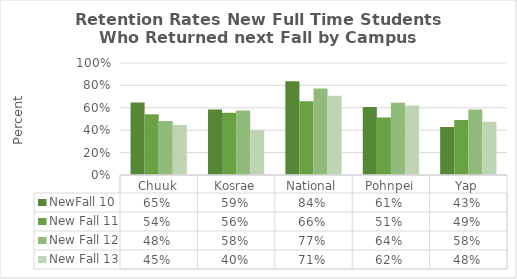
| Category | NewFall 10 | New Fall 11 | New Fall 12 | New Fall 13 |
|---|---|---|---|---|
| Chuuk | 0.647 | 0.542 | 0.482 | 0.447 |
| Kosrae | 0.585 | 0.556 | 0.576 | 0.4 |
| National | 0.836 | 0.658 | 0.772 | 0.708 |
| Pohnpei | 0.606 | 0.514 | 0.644 | 0.621 |
| Yap | 0.429 | 0.491 | 0.585 | 0.475 |